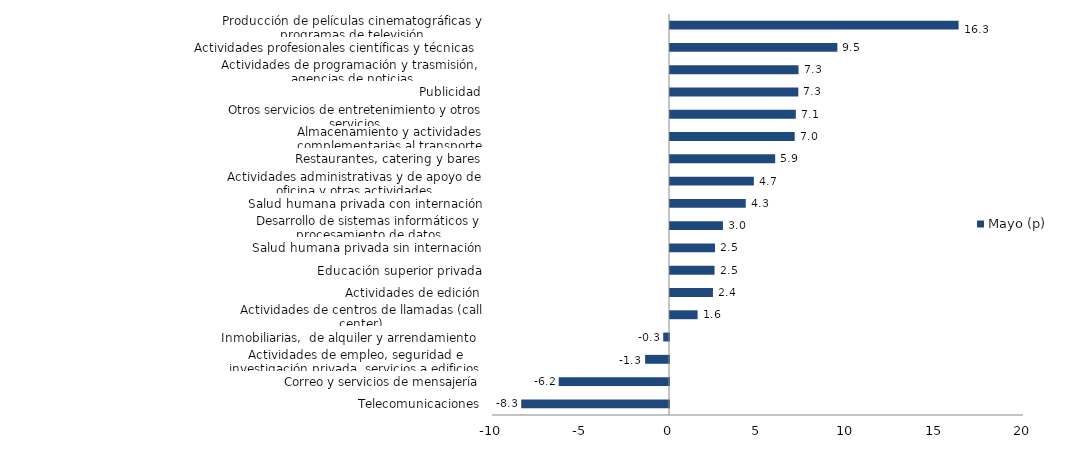
| Category | Mayo (p) |
|---|---|
| Telecomunicaciones | -8.35 |
| Correo y servicios de mensajería | -6.232 |
| Actividades de empleo, seguridad e investigación privada, servicios a edificios | -1.349 |
| Inmobiliarias,  de alquiler y arrendamiento  | -0.328 |
| Actividades de centros de llamadas (call center) | 1.56 |
| Actividades de edición | 2.427 |
| Educación superior privada | 2.517 |
| Salud humana privada sin internación | 2.542 |
| Desarrollo de sistemas informáticos y procesamiento de datos | 2.991 |
| Salud humana privada con internación | 4.28 |
| Actividades administrativas y de apoyo de oficina y otras actividades | 4.739 |
| Restaurantes, catering y bares | 5.943 |
| Almacenamiento y actividades complementarias al transporte | 7.044 |
| Otros servicios de entretenimiento y otros servicios | 7.109 |
| Publicidad | 7.251 |
| Actividades de programación y trasmisión,  agencias de noticias | 7.261 |
| Actividades profesionales científicas y técnicas  | 9.455 |
| Producción de películas cinematográficas y programas de televisión | 16.305 |